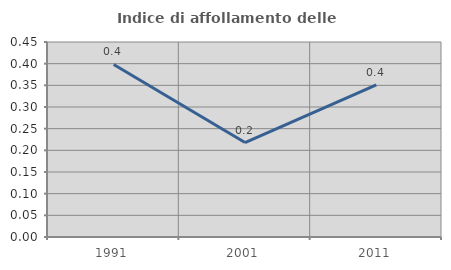
| Category | Indice di affollamento delle abitazioni  |
|---|---|
| 1991.0 | 0.398 |
| 2001.0 | 0.218 |
| 2011.0 | 0.351 |